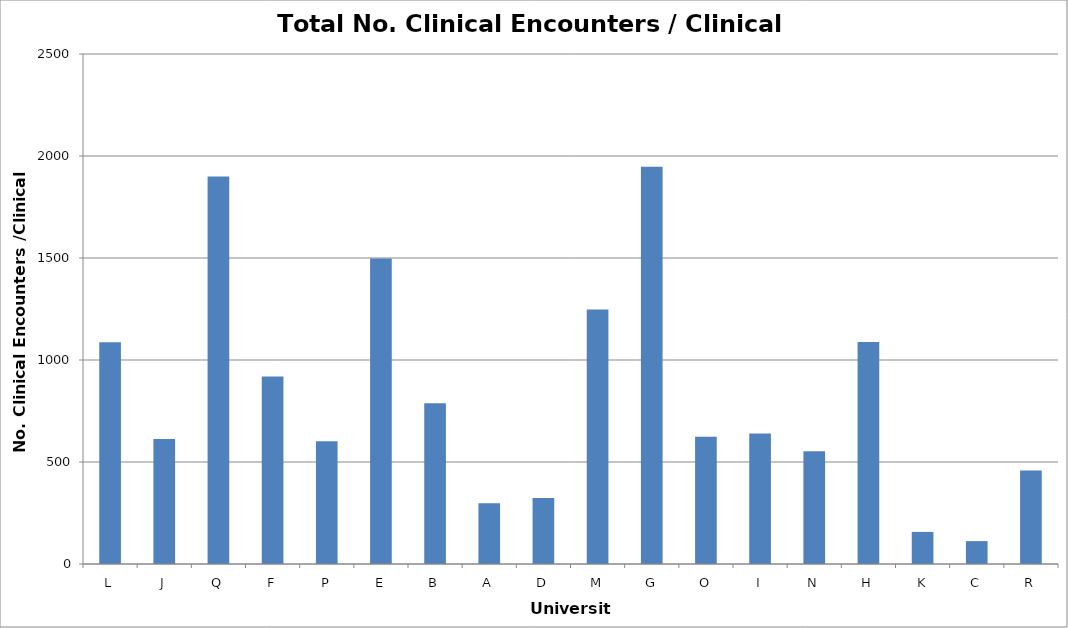
| Category | No. Clinical Encounters / Clinical FTE |
|---|---|
| L | 1086.786 |
| J | 612.4 |
| Q | 1900 |
| F | 918.919 |
| P | 602.188 |
| E | 1497.5 |
| B | 788.039 |
| A | 298.333 |
| D | 322.951 |
| M | 1247.059 |
| G | 1947.045 |
| O | 623.81 |
| I | 640 |
| N | 553 |
| H | 1087.727 |
| K | 157.308 |
| C | 112.207 |
| R | 458.039 |